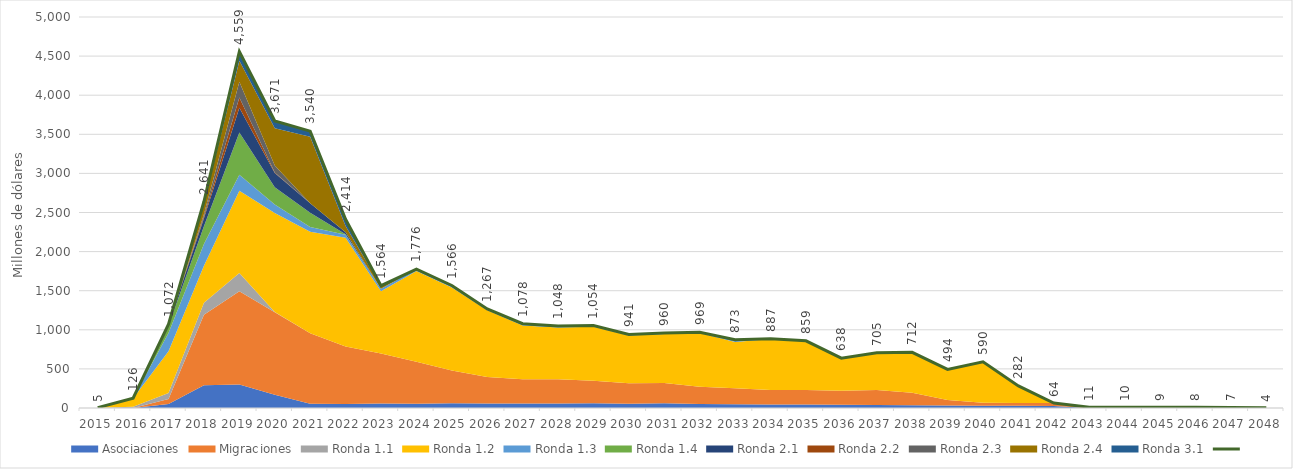
| Category | Series 11 |
|---|---|
| 2015 | 4.809 |
| 2016 | 125.699 |
| 2017 | 1072.307 |
| 2018 | 2640.647 |
| 2019 | 4558.647 |
| 2020 | 3670.97 |
| 2021 | 3539.886 |
| 2022 | 2414.443 |
| 2023 | 1563.599 |
| 2024 | 1776.488 |
| 2025 | 1566.321 |
| 2026 | 1267.105 |
| 2027 | 1078.371 |
| 2028 | 1047.518 |
| 2029 | 1053.757 |
| 2030 | 940.795 |
| 2031 | 960.225 |
| 2032 | 969.091 |
| 2033 | 872.99 |
| 2034 | 886.82 |
| 2035 | 859.452 |
| 2036 | 637.757 |
| 2037 | 705.204 |
| 2038 | 712.26 |
| 2039 | 493.604 |
| 2040 | 589.951 |
| 2041 | 282.456 |
| 2042 | 63.974 |
| 2043 | 11.076 |
| 2044 | 10.397 |
| 2045 | 9.347 |
| 2046 | 8.4 |
| 2047 | 7.386 |
| 2048 | 3.884 |